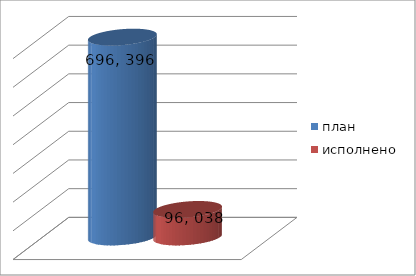
| Category | план | исполнено |
|---|---|---|
| 0 | 696396292.45 | 96038450.12 |